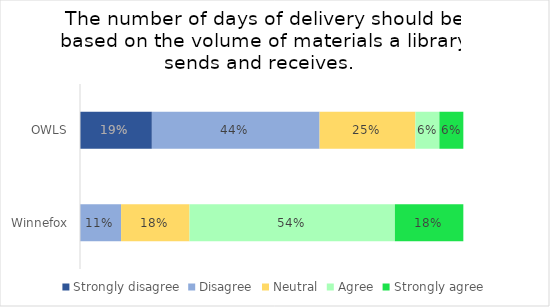
| Category | Strongly disagree | Disagree | Neutral | Agree | Strongly agree |
|---|---|---|---|---|---|
| OWLS | 0.188 | 0.438 | 0.25 | 0.062 | 0.062 |
| Winnefox | 0 | 0.107 | 0.179 | 0.536 | 0.179 |